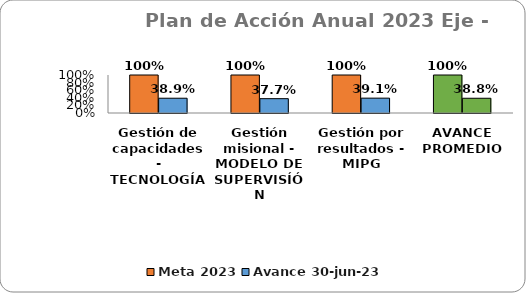
| Category | Meta 2023 | Avance 30-jun-23 |
|---|---|---|
| Gestión de capacidades - TECNOLOGÍA | 1 | 0.389 |
| Gestión misional - MODELO DE SUPERVISÍÓN | 1 | 0.377 |
| Gestión por resultados - MIPG | 1 | 0.391 |
| AVANCE PROMEDIO | 1 | 0.388 |